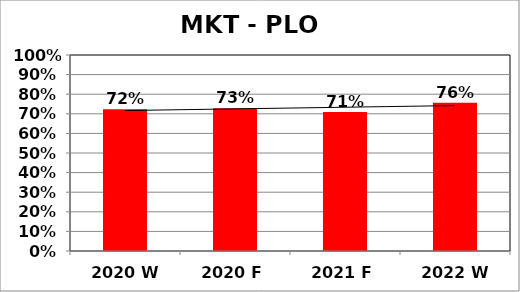
| Category | Series 0 |
|---|---|
| 2020 W | 0.723 |
| 2020 F | 0.728 |
| 2021 F | 0.71 |
| 2022 W | 0.757 |